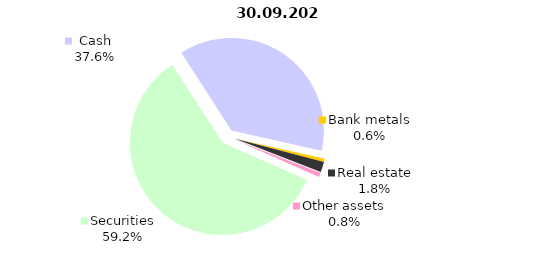
| Category | Total |
|---|---|
| Securities | 1132.899 |
| Cash | 719.882 |
| Bank metals | 11.037 |
| Real estate | 34.42 |
| Other assets | 14.972 |